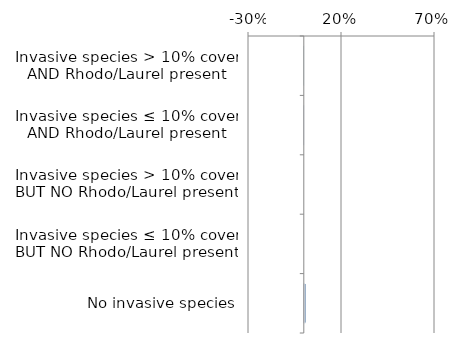
| Category | Near native & fragments |
|---|---|
| No invasive species | 0.012 |
| Invasive species ≤ 10% cover BUT NO Rhodo/Laurel present | 0 |
| Invasive species > 10% cover BUT NO Rhodo/Laurel present | 0 |
| Invasive species ≤ 10% cover AND Rhodo/Laurel present | 0.002 |
| Invasive species > 10% cover AND Rhodo/Laurel present | 0.001 |